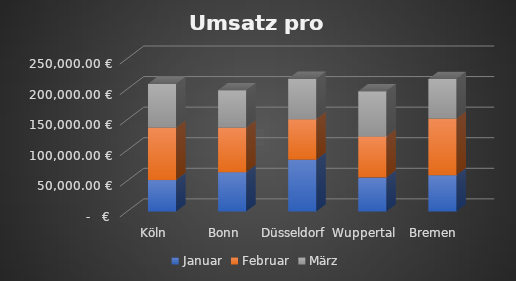
| Category | Januar | Februar | März |
|---|---|---|---|
| Köln | 51459 | 85757 | 71605 |
| Bonn | 64457 | 72656 | 61473 |
| Düsseldorf | 84853 | 66034 | 66350 |
| Wuppertal | 55507 | 67369 | 73939 |
| Bremen | 59421 | 92353 | 65021 |